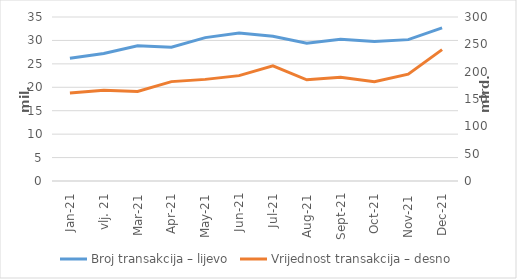
| Category | Broj transakcija – lijevo |
|---|---|
| sij.21 | 26216999 |
| vlj. 21 | 27204294 |
| ožu.21 | 28843884 |
| tra.21 | 28532494 |
| svi.21 | 30601997 |
| lip.21 | 31578019 |
| srp.21 | 30889827 |
| kol.21 | 29385323 |
| ruj.21 | 30235941 |
| lis.21 | 29789776 |
| stu.21 | 30168920 |
| pro.21 | 32667628 |